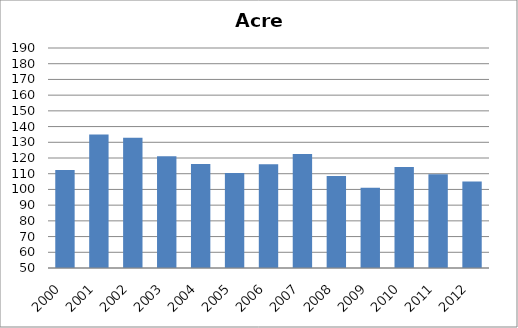
| Category | BCG |
|---|---|
| 2000.0 | 112.32 |
| 2001.0 | 134.96 |
| 2002.0 | 132.91 |
| 2003.0 | 121.07 |
| 2004.0 | 116.13 |
| 2005.0 | 110.46 |
| 2006.0 | 116.02 |
| 2007.0 | 122.55 |
| 2008.0 | 108.57 |
| 2009.0 | 101.11 |
| 2010.0 | 114.23 |
| 2011.0 | 109.63 |
| 2012.0 | 105 |